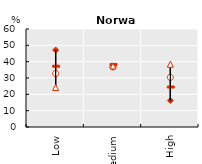
| Category | SD | MD | PWD | PWoD |
|---|---|---|---|---|
| Low | 47.158 | 32.719 | 37.225 | 24.208 |
| Medium | 36.591 | 36.893 | 38.3 | 37.361 |
| High | 16.252 | 30.388 | 24.474 | 38.431 |